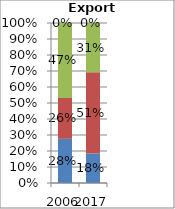
| Category | Other commercial services | Travel | Transport | Goods-related services |
|---|---|---|---|---|
| 2006.0 | 0.276 | 0.256 | 0.468 | 0 |
| 2017.0 | 0.184 | 0.508 | 0.308 | 0 |